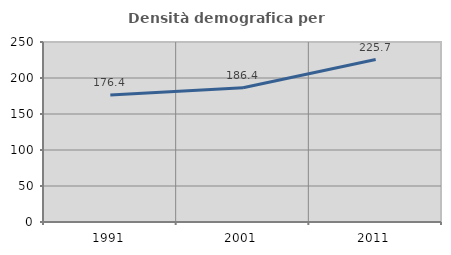
| Category | Densità demografica |
|---|---|
| 1991.0 | 176.379 |
| 2001.0 | 186.449 |
| 2011.0 | 225.677 |